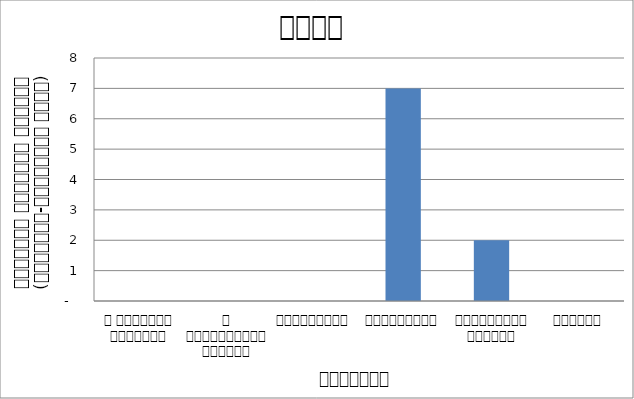
| Category | अन्य |
|---|---|
| द हिमालयन टाइम्स् | 0 |
| द काठमाण्डौं पोस्ट् | 0 |
| रिपब्लिका | 0 |
| कान्तिपुर | 7 |
| अन्नपूर्ण पोस्ट् | 2 |
| नागरिक | 0 |